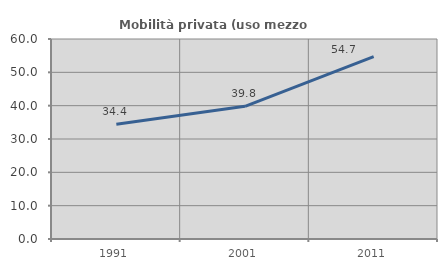
| Category | Mobilità privata (uso mezzo privato) |
|---|---|
| 1991.0 | 34.437 |
| 2001.0 | 39.806 |
| 2011.0 | 54.688 |